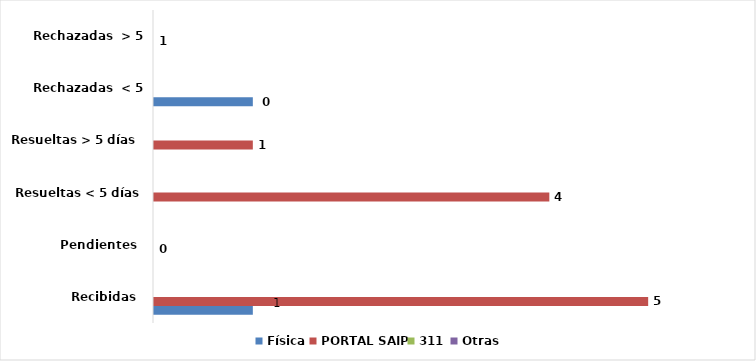
| Category | Física | PORTAL SAIP | 311 | Otras |
|---|---|---|---|---|
| Recibidas  | 1 | 5 | 0 | 0 |
| Pendientes  | 0 | 0 | 0 | 0 |
| Resueltas < 5 días | 0 | 4 | 0 | 0 |
| Resueltas > 5 días  | 0 | 1 | 0 | 0 |
| Rechazadas  < 5 días | 1 | 0 | 0 | 0 |
| Rechazadas  > 5 días | 0 | 0 | 0 | 0 |